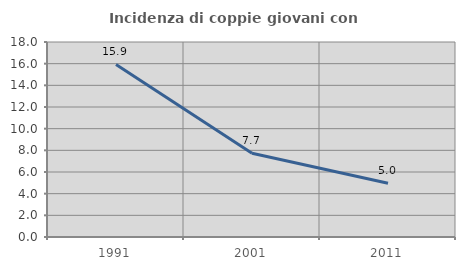
| Category | Incidenza di coppie giovani con figli |
|---|---|
| 1991.0 | 15.926 |
| 2001.0 | 7.731 |
| 2011.0 | 4.959 |